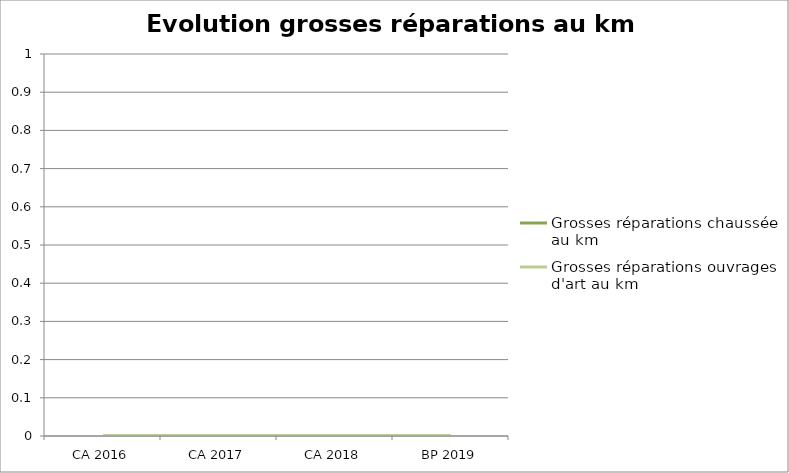
| Category | Grosses réparations chaussée au km | Grosses réparations ouvrages d'art au km |
|---|---|---|
| CA 2016 | 0 | 0 |
| CA 2017 | 0 | 0 |
| CA 2018 | 0 | 0 |
| BP 2019 | 0 | 0 |